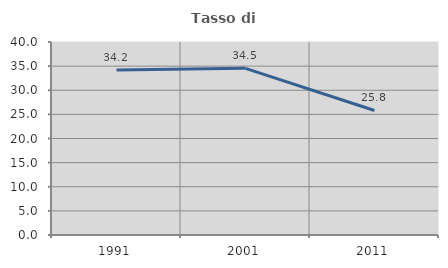
| Category | Tasso di occupazione   |
|---|---|
| 1991.0 | 34.177 |
| 2001.0 | 34.545 |
| 2011.0 | 25.806 |